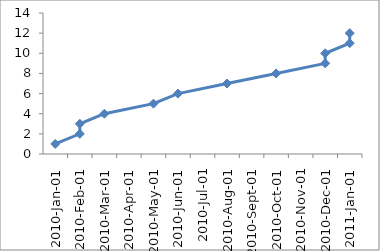
| Category | Series 1 |
|---|---|
| 2010-01-01 | 1 |
| 2010-02-01 | 2 |
| 2010-02-28 | 3 |
| 2010-03-31 | 4 |
| 2010-05-01 | 5 |
| 2010-06-01 | 6 |
| 2010-08-01 | 7 |
| 2010-10-01 | 8 |
| 2010-12-01 | 9 |
| 2010-12-31 | 10 |
| 2011-01-01 | 11 |
| 2011-01-31 | 12 |